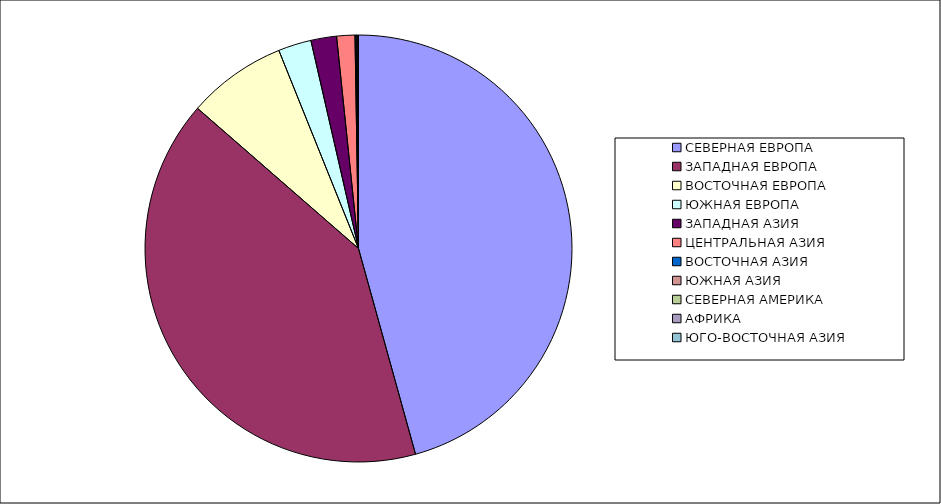
| Category | Оборот |
|---|---|
| СЕВЕРНАЯ ЕВРОПА | 45.695 |
| ЗАПАДНАЯ ЕВРОПА | 40.708 |
| ВОСТОЧНАЯ ЕВРОПА | 7.513 |
| ЮЖНАЯ ЕВРОПА | 2.502 |
| ЗАПАДНАЯ АЗИЯ | 1.943 |
| ЦЕНТРАЛЬНАЯ АЗИЯ | 1.376 |
| ВОСТОЧНАЯ АЗИЯ | 0.08 |
| ЮЖНАЯ АЗИЯ | 0.075 |
| СЕВЕРНАЯ АМЕРИКА | 0.072 |
| АФРИКА | 0.036 |
| ЮГО-ВОСТОЧНАЯ АЗИЯ | 0 |